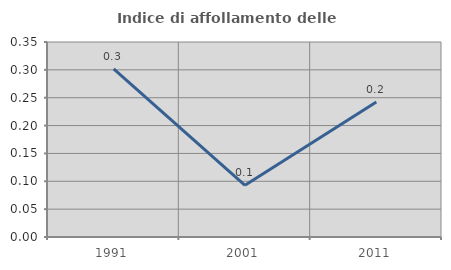
| Category | Indice di affollamento delle abitazioni  |
|---|---|
| 1991.0 | 0.302 |
| 2001.0 | 0.093 |
| 2011.0 | 0.242 |